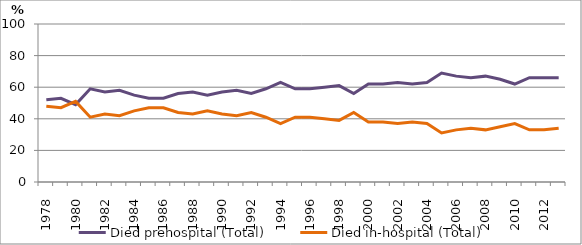
| Category | Died prehospital (Total) | Died in-hospital (Total) |
|---|---|---|
| 1978.0 | 52 | 48 |
| 1979.0 | 53 | 47 |
| 1980.0 | 49 | 51 |
| 1981.0 | 59 | 41 |
| 1982.0 | 57 | 43 |
| 1983.0 | 58 | 42 |
| 1984.0 | 55 | 45 |
| 1985.0 | 53 | 47 |
| 1986.0 | 53 | 47 |
| 1987.0 | 56 | 44 |
| 1988.0 | 57 | 43 |
| 1989.0 | 55 | 45 |
| 1990.0 | 57 | 43 |
| 1991.0 | 58 | 42 |
| 1992.0 | 56 | 44 |
| 1993.0 | 59 | 41 |
| 1994.0 | 63 | 37 |
| 1995.0 | 59 | 41 |
| 1996.0 | 59 | 41 |
| 1997.0 | 60 | 40 |
| 1998.0 | 61 | 39 |
| 1999.0 | 56 | 44 |
| 2000.0 | 62 | 38 |
| 2001.0 | 62 | 38 |
| 2002.0 | 63 | 37 |
| 2003.0 | 62 | 38 |
| 2004.0 | 63 | 37 |
| 2005.0 | 69 | 31 |
| 2006.0 | 67 | 33 |
| 2007.0 | 66 | 34 |
| 2008.0 | 67 | 33 |
| 2009.0 | 65 | 35 |
| 2010.0 | 62 | 37 |
| 2011.0 | 66 | 33 |
| 2012.0 | 66 | 33 |
| 2013.0 | 66 | 34 |